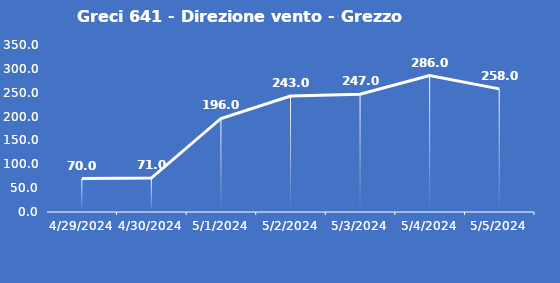
| Category | Greci 641 - Direzione vento - Grezzo (°N) |
|---|---|
| 4/29/24 | 70 |
| 4/30/24 | 71 |
| 5/1/24 | 196 |
| 5/2/24 | 243 |
| 5/3/24 | 247 |
| 5/4/24 | 286 |
| 5/5/24 | 258 |